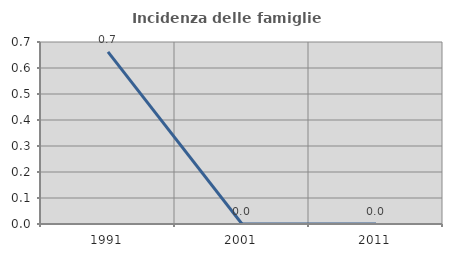
| Category | Incidenza delle famiglie numerose |
|---|---|
| 1991.0 | 0.662 |
| 2001.0 | 0 |
| 2011.0 | 0 |